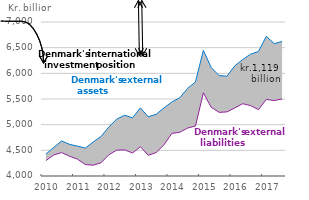
| Category | Assets | Liabilities |
|---|---|---|
| 0 | 4426.092 | 4300.871 |
| 1 | 4557.836 | 4409.648 |
| 2 | 4682.27 | 4456.138 |
| 3 | 4616.54 | 4384.284 |
| 4 | 4582.027 | 4329.569 |
| 5 | 4543.027 | 4223.766 |
| 6 | 4661.435 | 4210.247 |
| 7 | 4770.564 | 4258.041 |
| 8 | 4956.548 | 4413.891 |
| 9 | 5108.797 | 4504.096 |
| 10 | 5183.954 | 4509.13 |
| 11 | 5133.164 | 4447.646 |
| 12 | 5327.72 | 4570.712 |
| 13 | 5153.722 | 4402.636 |
| 14 | 5201.497 | 4456.176 |
| 15 | 5328.238 | 4608.387 |
| 16 | 5441.688 | 4829.667 |
| 17 | 5523.652 | 4851.703 |
| 18 | 5707.432 | 4933.445 |
| 19 | 5831.41 | 4974.185 |
| 20 | 6448.243 | 5619.405 |
| 21 | 6112.295 | 5339.52 |
| 22 | 5956.314 | 5239.724 |
| 23 | 5943.835 | 5249.11 |
| 24 | 6147.303 | 5326.553 |
| 25 | 6268.981 | 5408.108 |
| 26 | 6373.464 | 5371.135 |
| 27 | 6424.475 | 5292.217 |
| 28 | 6721.218 | 5492.477 |
| 29 | 6579.934 | 5469.223 |
| 30 | 6620 | 5501 |